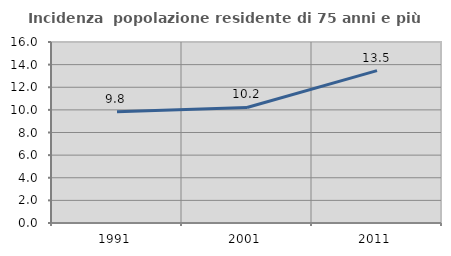
| Category | Incidenza  popolazione residente di 75 anni e più |
|---|---|
| 1991.0 | 9.827 |
| 2001.0 | 10.213 |
| 2011.0 | 13.469 |